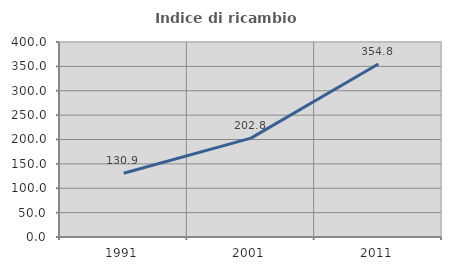
| Category | Indice di ricambio occupazionale  |
|---|---|
| 1991.0 | 130.894 |
| 2001.0 | 202.832 |
| 2011.0 | 354.839 |